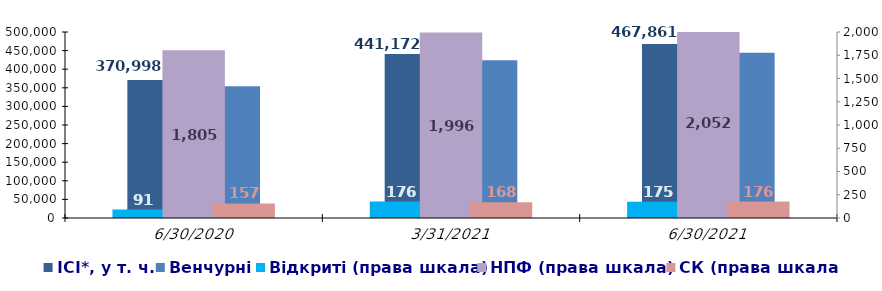
| Category | ІСІ*, у т. ч. | Венчурні |
|---|---|---|
| 6/30/20 | 370998.12 | 354500.31 |
| 3/31/21 | 441172.31 | 423794.79 |
| 6/30/21 | 467860.58 | 444027.69 |